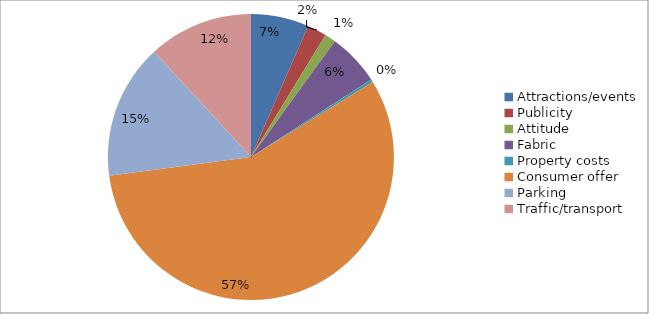
| Category | Series 4 | Series 3 | Series 2 | Series 1 | Series 0 |
|---|---|---|---|---|---|
| Attractions/events | 21 | 0 | 0 | 1 | 20 |
| Publicity | 7 | 0 | 0 | 6 | 1 |
| Attitude | 4 | 0 | 0 | 2 | 2 |
| Fabric | 19 | 0 | 0 | 3 | 16 |
| Property costs | 1 | 0 | 0 | 1 | 0 |
| Consumer offer | 182 | 1 | 4 | 14 | 72 |
| Parking | 49 | 0 | 0 | 3 | 46 |
| Traffic/transport | 38 | 2 | 3 | 10 | 23 |